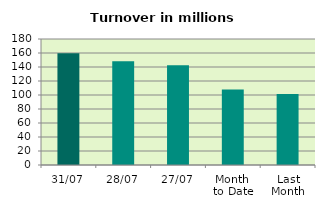
| Category | Series 0 |
|---|---|
| 31/07 | 159.584 |
| 28/07 | 148.308 |
| 27/07 | 142.355 |
| Month 
to Date | 108.022 |
| Last
Month | 101.544 |